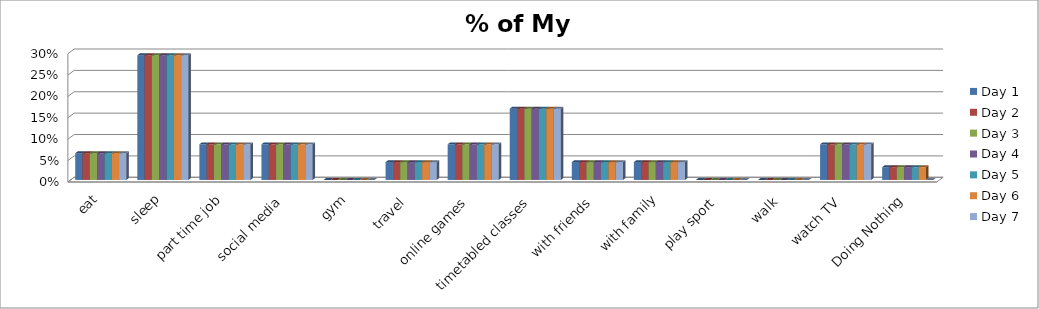
| Category | Day 1 | Day 2 | Day 3 | Day 4 | Day 5 | Day 6 | Day 7 |
|---|---|---|---|---|---|---|---|
| eat | 0.062 | 0.062 | 0.062 | 0.062 | 0.062 | 0.062 | 0.062 |
| sleep | 0.292 | 0.292 | 0.292 | 0.292 | 0.292 | 0.292 | 0.292 |
| part time job | 0.083 | 0.083 | 0.083 | 0.083 | 0.083 | 0.083 | 0.083 |
| social media | 0.083 | 0.083 | 0.083 | 0.083 | 0.083 | 0.083 | 0.083 |
| gym | 0 | 0 | 0 | 0 | 0 | 0 | 0 |
| travel | 0.042 | 0.042 | 0.042 | 0.042 | 0.042 | 0.042 | 0.042 |
| online games | 0.083 | 0.083 | 0.083 | 0.083 | 0.083 | 0.083 | 0.083 |
| timetabled classes | 0.167 | 0.167 | 0.167 | 0.167 | 0.167 | 0.167 | 0.167 |
| with friends | 0.042 | 0.042 | 0.042 | 0.042 | 0.042 | 0.042 | 0.042 |
| with family | 0.042 | 0.042 | 0.042 | 0.042 | 0.042 | 0.042 | 0.042 |
| play sport | 0 | 0 | 0 | 0 | 0 | 0 | 0 |
| walk | 0 | 0 | 0 | 0 | 0 | 0 | 0 |
| watch TV | 0.083 | 0.083 | 0.083 | 0.083 | 0.083 | 0.083 | 0.083 |
| Doing Nothing | 0.03 | 0.03 | 0.03 | 0.03 | 0.03 | 0.03 | 0 |